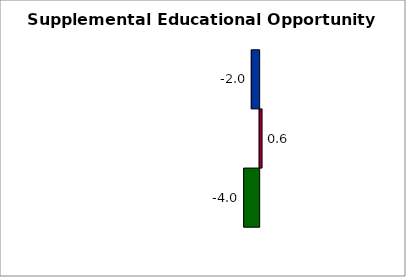
| Category | State | SREB states | 50 states and D.C. |
|---|---|---|---|
| 0 | -4.004 | 0.619 | -2.033 |